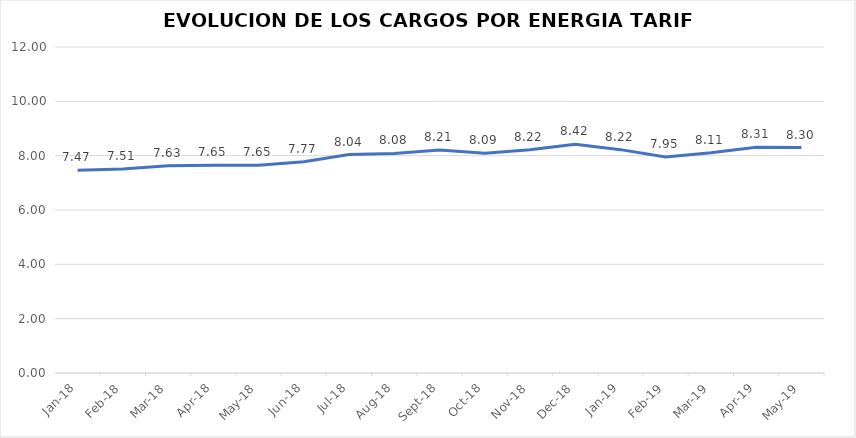
| Category | Series 0 |
|---|---|
| 2018-01-01 | 7.465 |
| 2018-02-01 | 7.51 |
| 2018-03-01 | 7.631 |
| 2018-04-01 | 7.647 |
| 2018-05-01 | 7.65 |
| 2018-06-01 | 7.775 |
| 2018-07-01 | 8.039 |
| 2018-08-01 | 8.083 |
| 2018-09-01 | 8.21 |
| 2018-10-01 | 8.091 |
| 2018-11-01 | 8.22 |
| 2018-12-01 | 8.42 |
| 2019-01-01 | 8.222 |
| 2019-02-01 | 7.952 |
| 2019-03-01 | 8.107 |
| 2019-04-01 | 8.31 |
| 2019-05-01 | 8.3 |